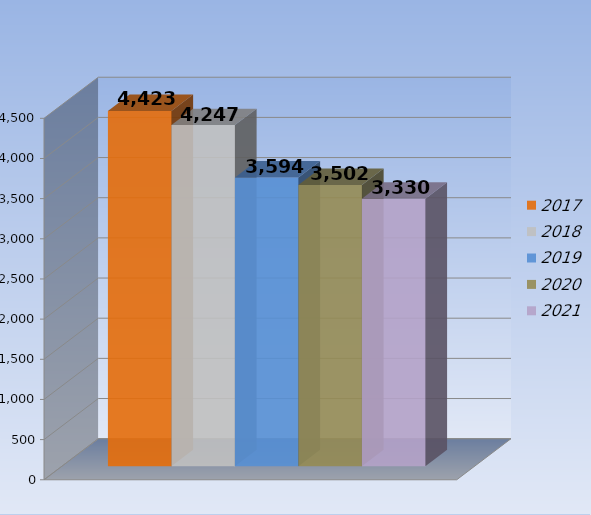
| Category | 2017 | 2018 | 2019 | 2020 | 2021 |
|---|---|---|---|---|---|
| 0 | 4423 | 4247 | 3594 | 3502 | 3330 |